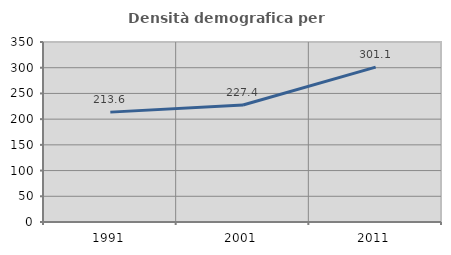
| Category | Densità demografica |
|---|---|
| 1991.0 | 213.642 |
| 2001.0 | 227.409 |
| 2011.0 | 301.148 |